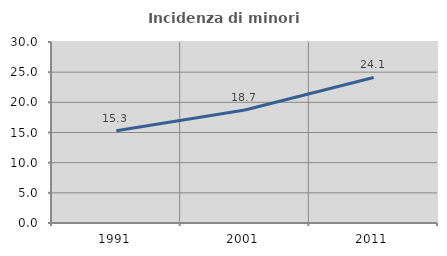
| Category | Incidenza di minori stranieri |
|---|---|
| 1991.0 | 15.294 |
| 2001.0 | 18.726 |
| 2011.0 | 24.124 |